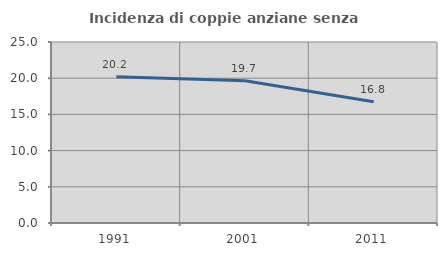
| Category | Incidenza di coppie anziane senza figli  |
|---|---|
| 1991.0 | 20.213 |
| 2001.0 | 19.653 |
| 2011.0 | 16.76 |